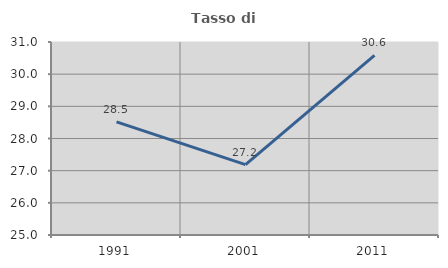
| Category | Tasso di occupazione   |
|---|---|
| 1991.0 | 28.519 |
| 2001.0 | 27.187 |
| 2011.0 | 30.587 |